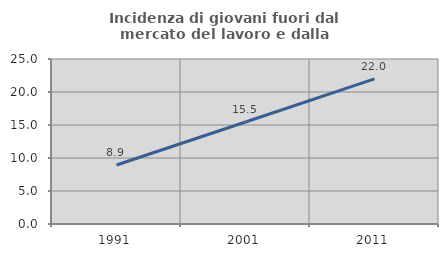
| Category | Incidenza di giovani fuori dal mercato del lavoro e dalla formazione  |
|---|---|
| 1991.0 | 8.939 |
| 2001.0 | 15.457 |
| 2011.0 | 21.978 |